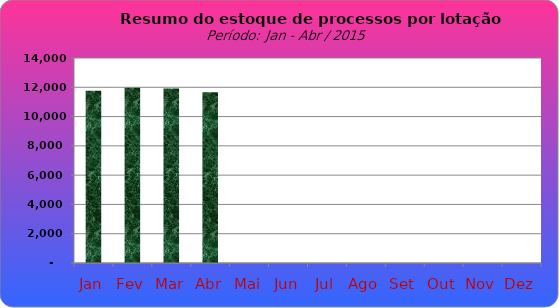
| Category | Series 0 |
|---|---|
| Jan | 11768 |
| Fev | 11973 |
| Mar | 11918 |
| Abr | 11669 |
| Mai | 0 |
| Jun | 0 |
| Jul | 0 |
| Ago | 0 |
| Set | 0 |
| Out | 0 |
| Nov | 0 |
| Dez | 0 |